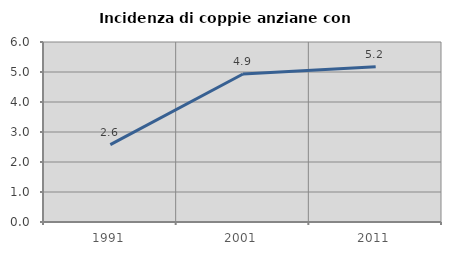
| Category | Incidenza di coppie anziane con figli |
|---|---|
| 1991.0 | 2.579 |
| 2001.0 | 4.934 |
| 2011.0 | 5.172 |